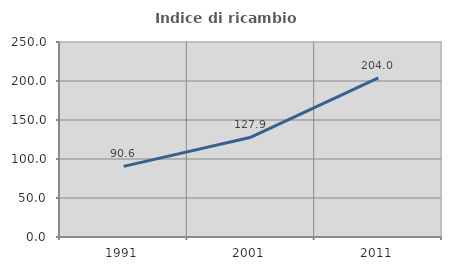
| Category | Indice di ricambio occupazionale  |
|---|---|
| 1991.0 | 90.551 |
| 2001.0 | 127.941 |
| 2011.0 | 204.04 |